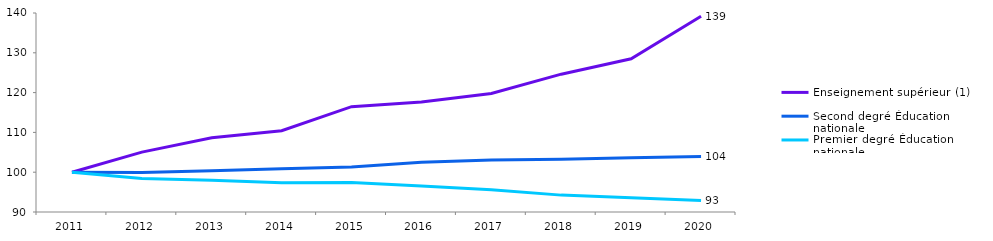
| Category | Enseignement supérieur (1) | Second degré Éducation nationale | Premier degré Éducation nationale |
|---|---|---|---|
| 2011.0 | 100 | 100 | 100 |
| 2012.0 | 105.046 | 99.95 | 98.4 |
| 2013.0 | 108.652 | 100.365 | 97.971 |
| 2014.0 | 110.422 | 100.857 | 97.372 |
| 2015.0 | 116.457 | 101.329 | 97.41 |
| 2016.0 | 117.659 | 102.481 | 96.526 |
| 2017.0 | 119.77 | 103.048 | 95.581 |
| 2018.0 | 124.629 | 103.239 | 94.241 |
| 2019.0 | 128.494 | 103.613 | 93.57 |
| 2020.0 | 139.182 | 103.922 | 92.868 |